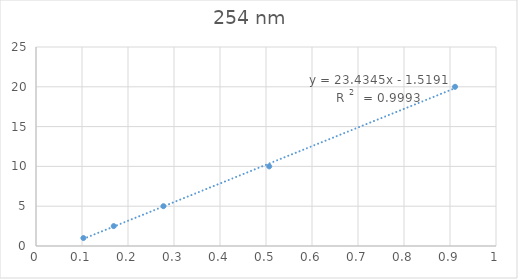
| Category | Series 0 |
|---|---|
| 0.103 | 1 |
| 0.277 | 5 |
| 0.507 | 10 |
| 0.911 | 20 |
| 0.169 | 2.5 |